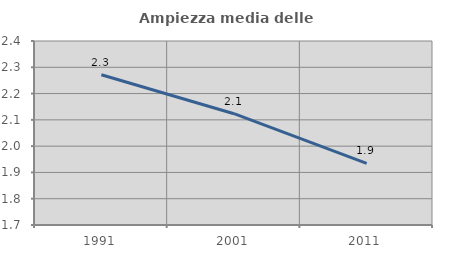
| Category | Ampiezza media delle famiglie |
|---|---|
| 1991.0 | 2.272 |
| 2001.0 | 2.123 |
| 2011.0 | 1.934 |